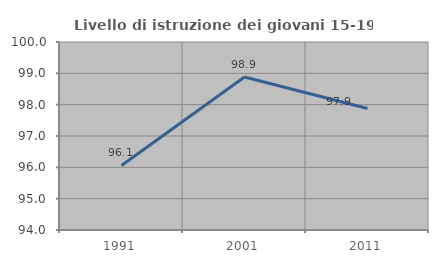
| Category | Livello di istruzione dei giovani 15-19 anni |
|---|---|
| 1991.0 | 96.059 |
| 2001.0 | 98.885 |
| 2011.0 | 97.88 |